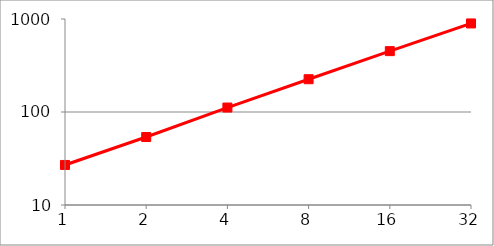
| Category | Series 0 |
|---|---|
| 1.0 | 26.95 |
| 2.0 | 53.81 |
| 4.0 | 111.67 |
| 8.0 | 225.1 |
| 16.0 | 451.39 |
| 32.0 | 895.94 |